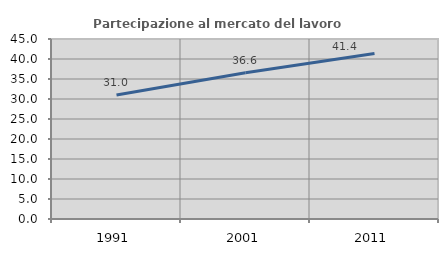
| Category | Partecipazione al mercato del lavoro  femminile |
|---|---|
| 1991.0 | 30.98 |
| 2001.0 | 36.583 |
| 2011.0 | 41.396 |